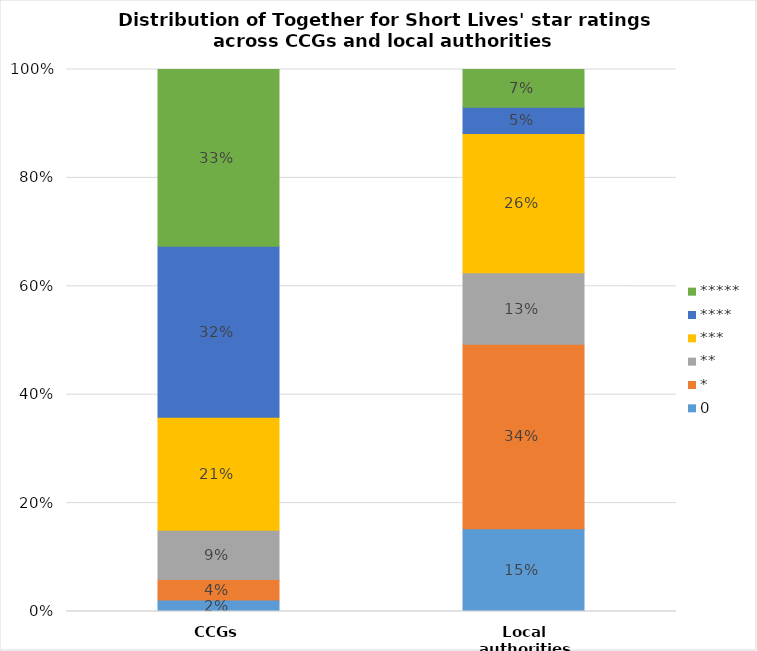
| Category | 0 | * | ** | *** | **** | ***** |
|---|---|---|---|---|---|---|
| CCGs | 0.021 | 0.037 | 0.091 | 0.209 | 0.316 | 0.326 |
| Local authorities | 0.153 | 0.34 | 0.132 | 0.257 | 0.049 | 0.069 |